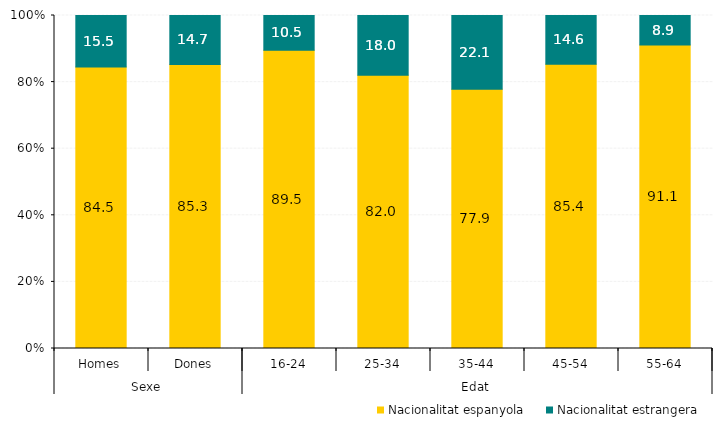
| Category | Nacionalitat espanyola | Nacionalitat estrangera |
|---|---|---|
| 0 | 84.536 | 15.464 |
| 1 | 85.314 | 14.686 |
| 2 | 89.535 | 10.465 |
| 3 | 82.04 | 17.96 |
| 4 | 77.856 | 22.144 |
| 5 | 85.366 | 14.634 |
| 6 | 91.129 | 8.871 |